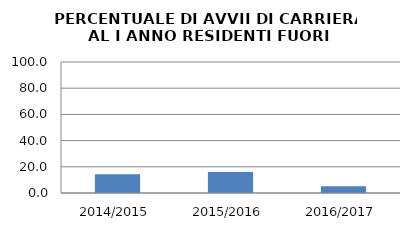
| Category | 2014/2015 2015/2016 2016/2017 |
|---|---|
| 2014/2015 | 14.286 |
| 2015/2016 | 16 |
| 2016/2017 | 5.128 |